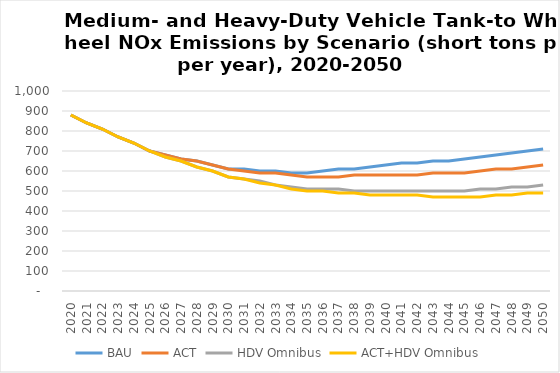
| Category | BAU | ACT | HDV Omnibus | ACT+HDV Omnibus |
|---|---|---|---|---|
| 2020.0 | 880 | 880 | 880 | 880 |
| 2021.0 | 840 | 840 | 840 | 840 |
| 2022.0 | 810 | 810 | 810 | 810 |
| 2023.0 | 770 | 770 | 770 | 770 |
| 2024.0 | 740 | 740 | 740 | 740 |
| 2025.0 | 700 | 700 | 700 | 700 |
| 2026.0 | 680 | 680 | 670 | 670 |
| 2027.0 | 660 | 660 | 650 | 650 |
| 2028.0 | 650 | 650 | 620 | 620 |
| 2029.0 | 630 | 630 | 600 | 600 |
| 2030.0 | 610 | 610 | 570 | 570 |
| 2031.0 | 610 | 600 | 560 | 560 |
| 2032.0 | 600 | 590 | 550 | 540 |
| 2033.0 | 600 | 590 | 530 | 530 |
| 2034.0 | 590 | 580 | 520 | 510 |
| 2035.0 | 590 | 570 | 510 | 500 |
| 2036.0 | 600 | 570 | 510 | 500 |
| 2037.0 | 610 | 570 | 510 | 490 |
| 2038.0 | 610 | 580 | 500 | 490 |
| 2039.0 | 620 | 580 | 500 | 480 |
| 2040.0 | 630 | 580 | 500 | 480 |
| 2041.0 | 640 | 580 | 500 | 480 |
| 2042.0 | 640 | 580 | 500 | 480 |
| 2043.0 | 650 | 590 | 500 | 470 |
| 2044.0 | 650 | 590 | 500 | 470 |
| 2045.0 | 660 | 590 | 500 | 470 |
| 2046.0 | 670 | 600 | 510 | 470 |
| 2047.0 | 680 | 610 | 510 | 480 |
| 2048.0 | 690 | 610 | 520 | 480 |
| 2049.0 | 700 | 620 | 520 | 490 |
| 2050.0 | 710 | 630 | 530 | 490 |